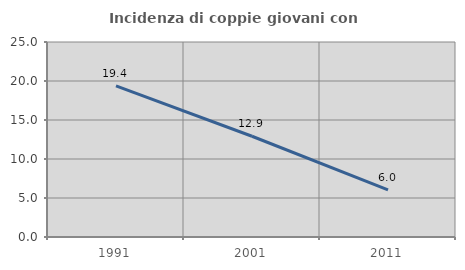
| Category | Incidenza di coppie giovani con figli |
|---|---|
| 1991.0 | 19.371 |
| 2001.0 | 12.914 |
| 2011.0 | 6.04 |